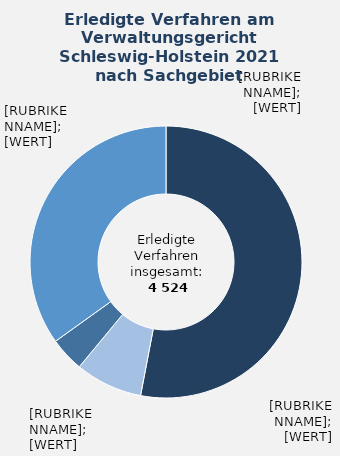
| Category | in Prozent |
|---|---|
| Asylrecht - Hauptsacheverfahren (Asylrecht, Verteilung von Asylbewerbenden) | 0.53 |
| Asylrecht - Hauptsacheverfahren (Dublin-Verfahren nach § 29 Absatz 1 Nummer 1 Buchstabe a) AsylG) | 0.08 |
| Bildungsrecht und Sport 
(ohne NC-Verfahren) | 0.041 |
| Übrige Sachgebiete¹ | 0.349 |